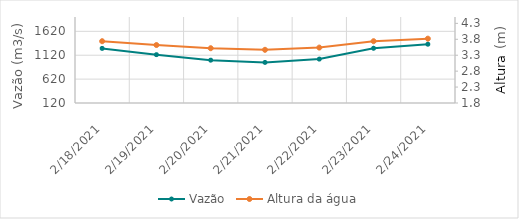
| Category | Vazão |
|---|---|
| 2/2/21 | 1661.57 |
| 2/1/21 | 1486.51 |
| 1/31/21 | 1485.73 |
| 1/30/21 | 1435.89 |
| 1/29/21 | 1342.03 |
| 1/28/21 | 1308.86 |
| 1/27/21 | 1285.44 |